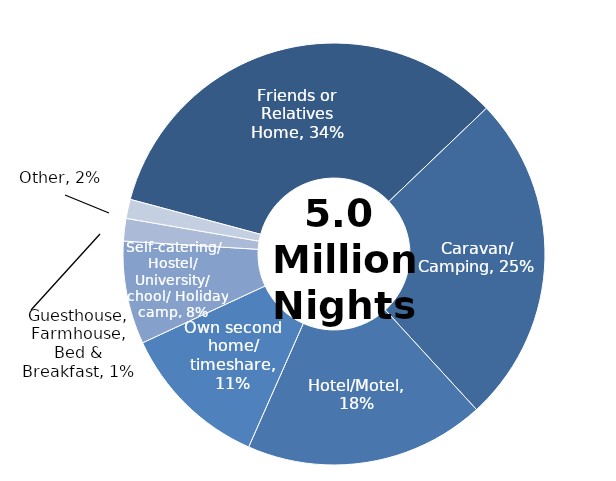
| Category | Series 0 |
|---|---|
| Friends or Relatives Home | 0.337 |
| Caravan/ Camping | 0.253 |
| Hotel/Motel | 0.184 |
| Own second home/ timeshare | 0.115 |
| Self-catering/ Hostel/ University/ School/ Holiday camp | 0.079 |
| Other | 0.017 |
| Guesthouse, Farmhouse, Bed & Breakfast | 0.015 |